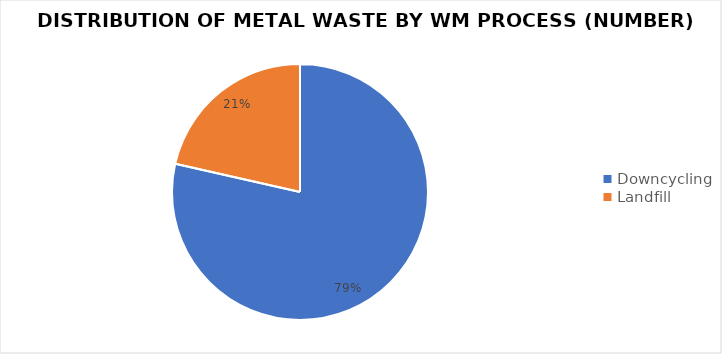
| Category | Series 0 |
|---|---|
| Downcycling | 1476 |
| Landfill | 403 |